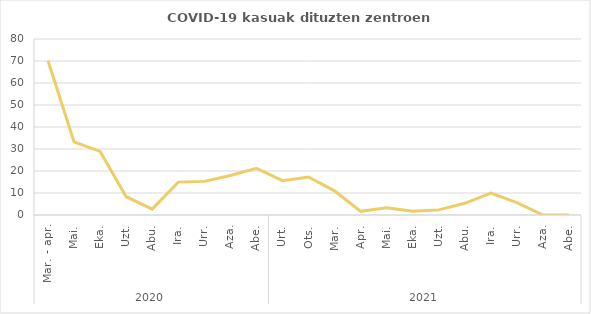
| Category | "Proporción de centros con casos de COVID-19 (%)" |
|---|---|
| 0 | 70.1 |
| 1 | 33.223 |
| 2 | 28.904 |
| 3 | 8.306 |
| 4 | 2.658 |
| 5 | 14.95 |
| 6 | 15.282 |
| 7 | 17.94 |
| 8 | 21.262 |
| 9 | 15.615 |
| 10 | 17.276 |
| 11 | 10.963 |
| 12 | 1.661 |
| 13 | 3.322 |
| 14 | 1.661 |
| 15 | 2.326 |
| 16 | 5.316 |
| 17 | 9.967 |
| 18 | 5.648 |
| 19 | 0 |
| 20 | 0 |